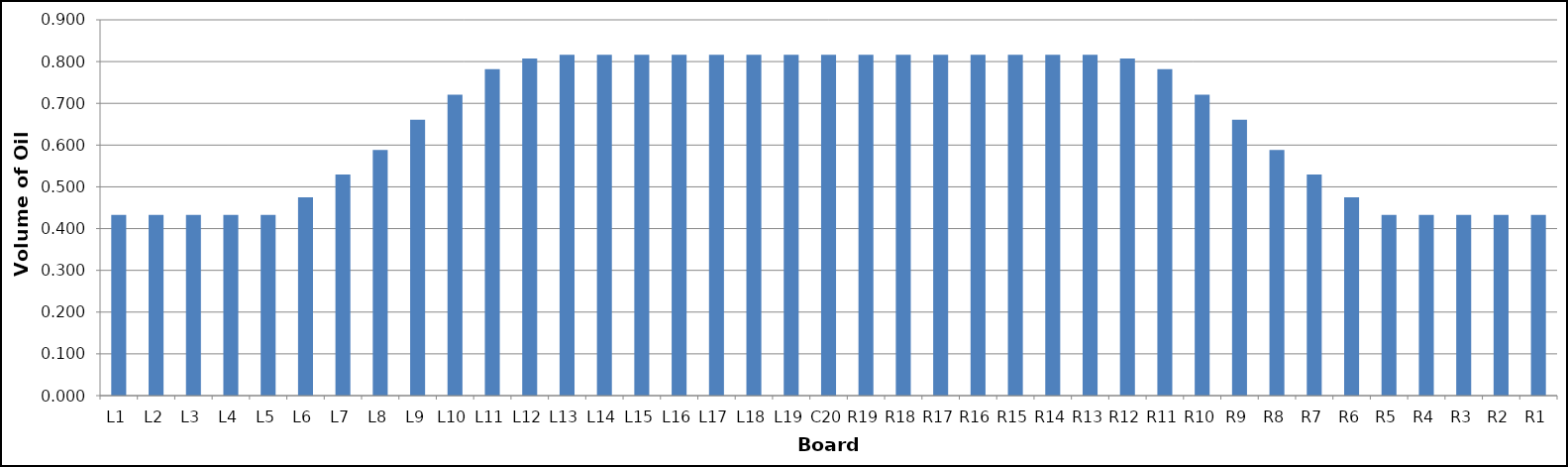
| Category | Series 0 |
|---|---|
| L1 | 0.433 |
| L2 | 0.433 |
| L3 | 0.433 |
| L4 | 0.433 |
| L5 | 0.433 |
| L6 | 0.475 |
| L7 | 0.529 |
| L8 | 0.589 |
| L9 | 0.661 |
| L10 | 0.721 |
| L11 | 0.782 |
| L12 | 0.807 |
| L13 | 0.816 |
| L14 | 0.816 |
| L15 | 0.816 |
| L16 | 0.816 |
| L17 | 0.816 |
| L18 | 0.816 |
| L19 | 0.816 |
| C20 | 0.816 |
| R19 | 0.816 |
| R18 | 0.816 |
| R17 | 0.816 |
| R16 | 0.816 |
| R15 | 0.816 |
| R14 | 0.816 |
| R13 | 0.816 |
| R12 | 0.807 |
| R11 | 0.782 |
| R10 | 0.721 |
| R9 | 0.661 |
| R8 | 0.589 |
| R7 | 0.529 |
| R6 | 0.475 |
| R5 | 0.433 |
| R4 | 0.433 |
| R3 | 0.433 |
| R2 | 0.433 |
| R1 | 0.433 |